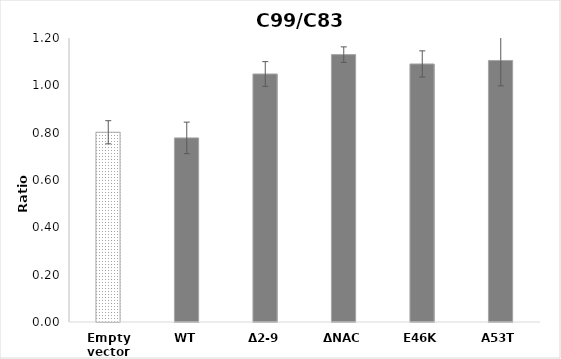
| Category | Series 0 |
|---|---|
| Empty vector | 0.802 |
| WT | 0.778 |
| Δ2-9 | 1.048 |
| ΔNAC | 1.13 |
| E46K | 1.09 |
| A53T | 1.105 |